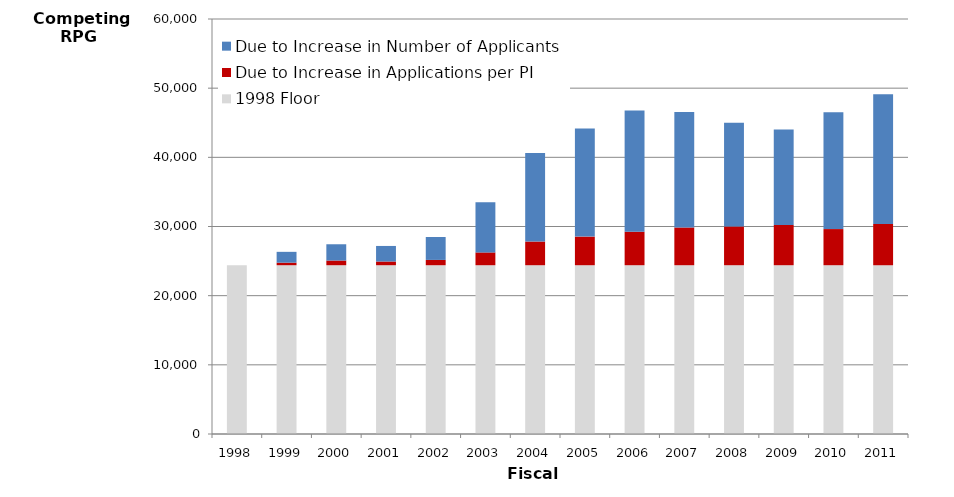
| Category |  1998 Floor |  Due to Increase in Applications per PI |  Due to Increase in Number of Applicants |
|---|---|---|---|
| 1998.0 | 24401 | 0 | 0 |
| 1999.0 | 24401 | 370.291 | 1564.709 |
| 2000.0 | 24401 | 678.686 | 2352.314 |
| 2001.0 | 24401 | 538.362 | 2247.638 |
| 2002.0 | 24401 | 767.612 | 3310.388 |
| 2003.0 | 24401 | 1852.445 | 7234.555 |
| 2004.0 | 24401 | 3424.46 | 12794.54 |
| 2005.0 | 24401 | 4138.855 | 15640.145 |
| 2006.0 | 24401 | 4844.604 | 17537.396 |
| 2007.0 | 24401 | 5457.948 | 16700.052 |
| 2008.0 | 24401 | 5605.446 | 14994.554 |
| 2009.0 | 24401 | 5828.188 | 13780.812 |
| 2010.0 | 24401 | 5225.283 | 16875.717 |
| 2011.0 | 24401 | 5964.765 | 18749.235 |